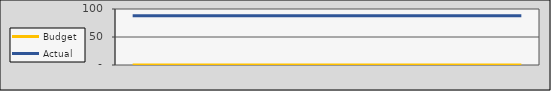
| Category | Budget | Actual |
|---|---|---|
| 2020-07-01 | 0 | 88 |
| 2020-08-01 | 0 | 88 |
| 2020-09-01 | 0 | 88 |
| 2020-10-02 | 0 | 88 |
| 2020-11-02 | 0 | 88 |
| 2020-12-03 | 0 | 88 |
| 2021-01-03 | 0 | 88 |
| 2021-02-03 | 0 | 88 |
| 2021-03-06 | 0 | 88 |
| 2021-04-06 | 0 | 88 |
| 2021-05-07 | 0 | 88 |
| 2021-06-07 | 0 | 88 |